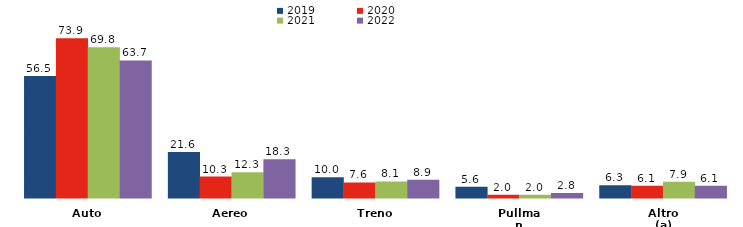
| Category | 2019 | 2020 | 2021 | 2022 |
|---|---|---|---|---|
| Auto | 56.5 | 73.9 | 69.8 | 63.7 |
| Aereo | 21.6 | 10.3 | 12.3 | 18.3 |
| Treno | 10 | 7.6 | 8.1 | 8.9 |
| Pullman | 5.6 | 2 | 2 | 2.8 |
| Altro (a) | 6.3 | 6.1 | 7.9 | 6.1 |